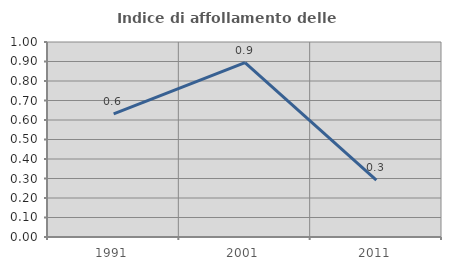
| Category | Indice di affollamento delle abitazioni  |
|---|---|
| 1991.0 | 0.632 |
| 2001.0 | 0.894 |
| 2011.0 | 0.292 |